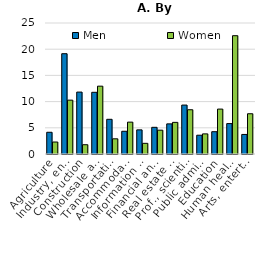
| Category | Men  | Women |
|---|---|---|
| Agriculture | 4.148 | 2.285 |
| Industry, energy production | 19.14 | 10.278 |
| Construction | 11.817 | 1.772 |
| Wholesale and retail trade, repair | 11.775 | 12.947 |
| Transportation and storage | 6.62 | 2.899 |
| Accommodation and food service | 4.336 | 6.082 |
| Information and communication | 4.605 | 2.035 |
| Financial and insurance activities | 5.09 | 4.545 |
| Real estate and adm. activities | 5.75 | 6.038 |
| Prof., scientific and tech. activities | 9.339 | 8.447 |
| Public administration | 3.585 | 3.84 |
| Education | 4.257 | 8.572 |
| Human health and social work | 5.805 | 22.579 |
| Arts, entertain., recreation and other | 3.732 | 7.681 |